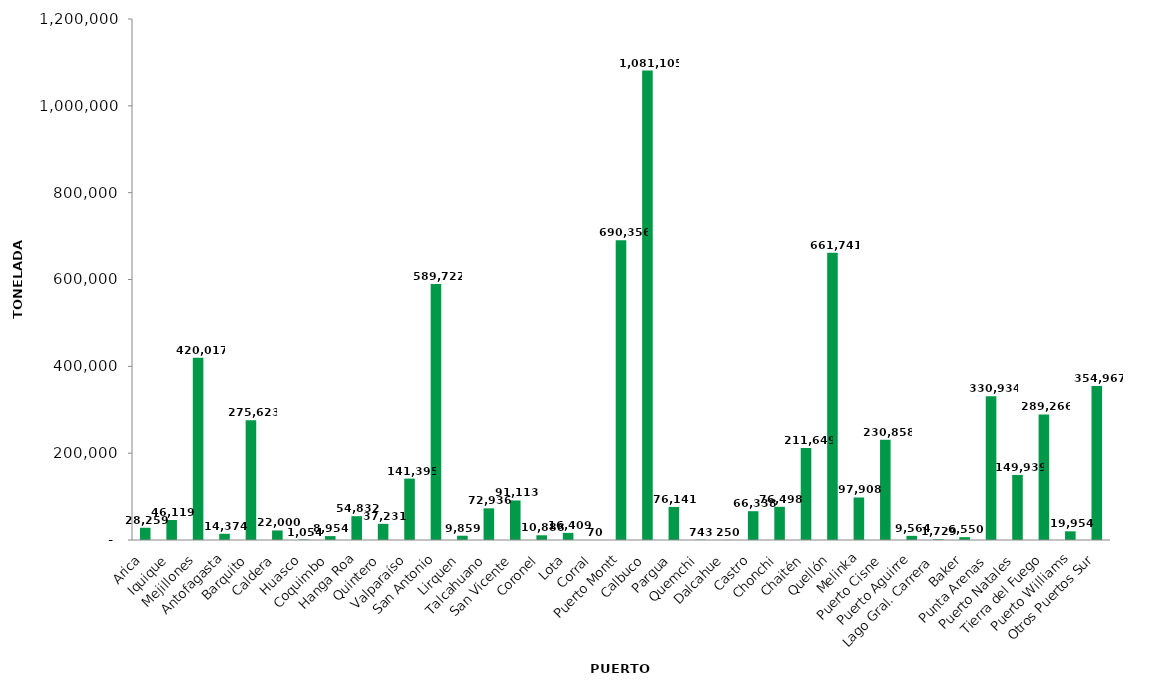
| Category | Series 0 |
|---|---|
| Arica | 28259.2 |
| Iquique | 46119.37 |
| Mejillones | 420016.85 |
| Antofagasta | 14374 |
| Barquito | 275622.539 |
| Caldera | 22000 |
| Huasco | 1054 |
| Coquimbo | 8954 |
| Hanga Roa | 54832.16 |
| Quintero | 37231 |
| Valparaíso | 141394.749 |
| San Antonio | 589721.6 |
| Lirquen | 9858.979 |
| Talcahuano | 72936 |
| San Vicente | 91113.2 |
| Coronel | 10888.47 |
| Lota | 16409 |
| Corral | 70 |
| Puerto Montt | 690356.05 |
| Calbuco | 1081104.99 |
| Pargua | 76140.75 |
| Quemchi | 743 |
| Dalcahue | 250 |
| Castro | 66338 |
| Chonchi | 76497.5 |
| Chaitén | 211649 |
| Quellón | 661740.7 |
| Melinka | 97908 |
| Puerto Cisne | 230858 |
| Puerto Aguirre | 9564.445 |
| Lago Gral. Carrera | 1729 |
| Baker | 6550 |
| Punta Arenas | 330934.33 |
| Puerto Natales | 149939 |
| Tierra del Fuego | 289266 |
| Puerto Williams | 19954 |
| Otros Puertos Sur | 354966.85 |